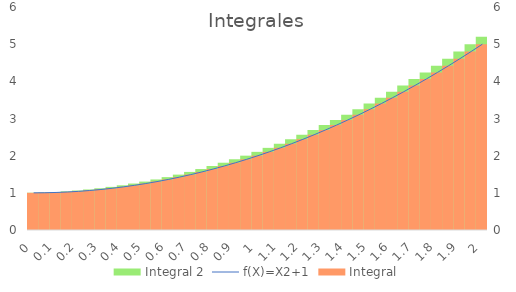
| Category | Integral 2 |
|---|---|
| 0.0 | 1.002 |
| 0.05 | 1.01 |
| 0.1 | 1.022 |
| 0.15 | 1.04 |
| 0.2 | 1.062 |
| 0.25 | 1.09 |
| 0.3 | 1.122 |
| 0.35 | 1.16 |
| 0.4 | 1.203 |
| 0.45 | 1.25 |
| 0.5 | 1.302 |
| 0.55 | 1.36 |
| 0.6 | 1.422 |
| 0.65 | 1.49 |
| 0.7 | 1.562 |
| 0.75 | 1.64 |
| 0.8 | 1.722 |
| 0.85 | 1.81 |
| 0.9 | 1.902 |
| 0.95 | 2 |
| 1.0 | 2.102 |
| 1.05 | 2.21 |
| 1.1 | 2.322 |
| 1.15 | 2.44 |
| 1.2 | 2.562 |
| 1.25 | 2.69 |
| 1.3 | 2.823 |
| 1.35 | 2.96 |
| 1.4 | 3.102 |
| 1.45 | 3.25 |
| 1.5 | 3.403 |
| 1.55 | 3.56 |
| 1.6 | 3.722 |
| 1.65 | 3.89 |
| 1.7 | 4.062 |
| 1.75 | 4.24 |
| 1.8 | 4.422 |
| 1.85 | 4.61 |
| 1.9 | 4.802 |
| 1.95 | 5 |
| 2.0 | 5.202 |